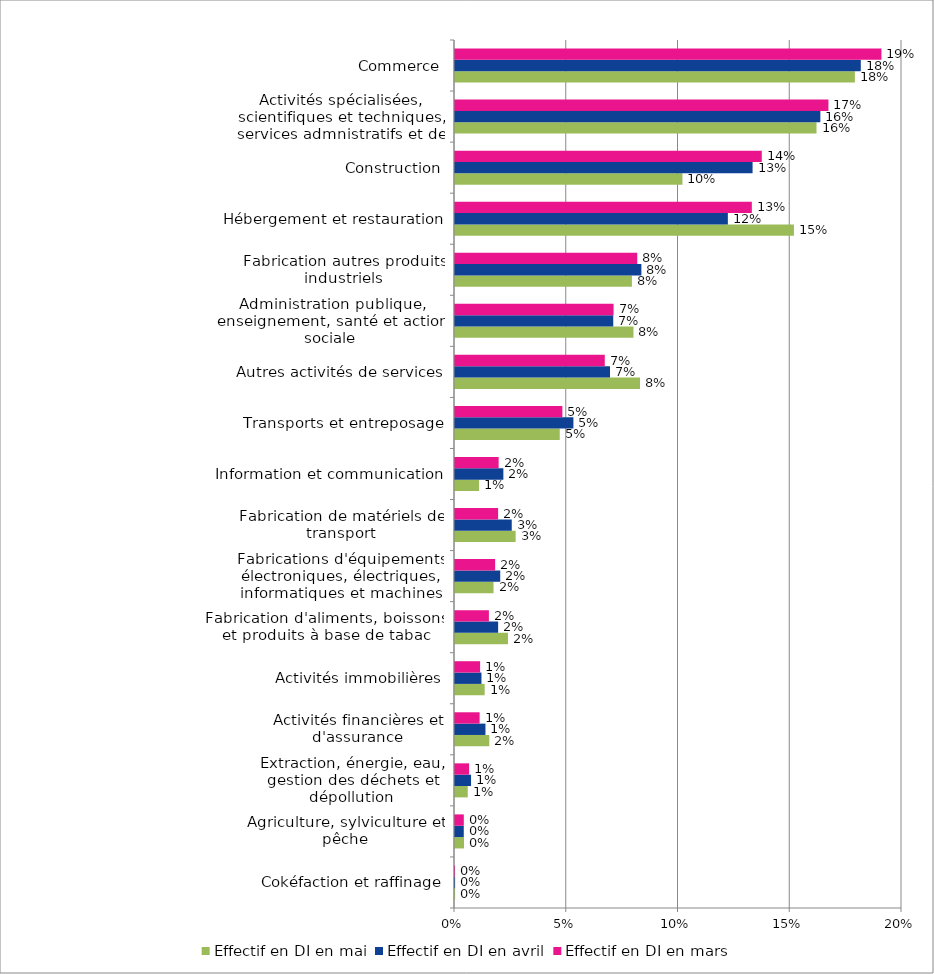
| Category | Effectif en DI en mai | Effectif en DI en avril | Effectif en DI en mars |
|---|---|---|---|
| Cokéfaction et raffinage | 0 | 0 | 0 |
| Agriculture, sylviculture et pêche | 0.004 | 0.004 | 0.004 |
| Extraction, énergie, eau, gestion des déchets et dépollution | 0.006 | 0.007 | 0.006 |
| Activités financières et d'assurance | 0.015 | 0.014 | 0.011 |
| Activités immobilières | 0.013 | 0.012 | 0.011 |
| Fabrication d'aliments, boissons et produits à base de tabac | 0.024 | 0.019 | 0.015 |
| Fabrications d'équipements électroniques, électriques, informatiques et machines | 0.017 | 0.02 | 0.018 |
| Fabrication de matériels de transport | 0.027 | 0.025 | 0.019 |
| Information et communication | 0.011 | 0.022 | 0.02 |
| Transports et entreposage | 0.047 | 0.053 | 0.048 |
| Autres activités de services | 0.083 | 0.069 | 0.067 |
| Administration publique, enseignement, santé et action sociale | 0.08 | 0.071 | 0.071 |
| Fabrication autres produits industriels | 0.079 | 0.083 | 0.082 |
| Hébergement et restauration | 0.152 | 0.122 | 0.133 |
| Construction | 0.102 | 0.133 | 0.137 |
| Activités spécialisées, scientifiques et techniques, services admnistratifs et de soutien | 0.162 | 0.163 | 0.167 |
| Commerce | 0.179 | 0.182 | 0.191 |